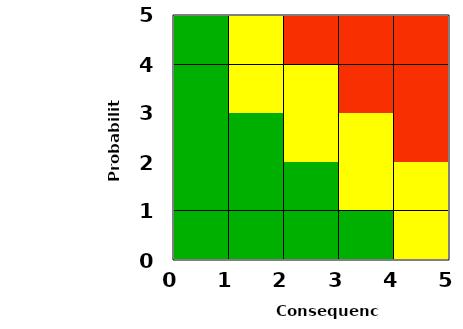
| Category | Series 0 |
|---|---|
| 2.1 | 0 |